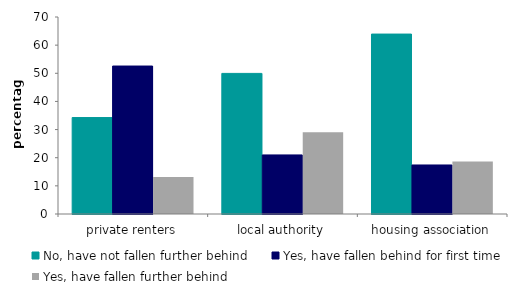
| Category | No, have not fallen further behind | Yes, have fallen behind for first time | Yes, have fallen further behind |
|---|---|---|---|
| private renters | 34.268 | 52.574 | 13.159 |
| local authority | 49.961 | 20.992 | 29.047 |
| housing association | 63.935 | 17.421 | 18.644 |